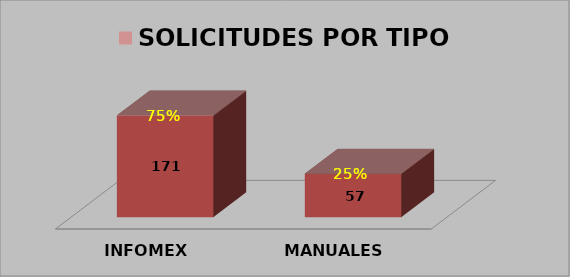
| Category | SOLICITUDES POR TIPO |
|---|---|
| INFOMEX | 0.701 |
| MANUALES | 0.299 |